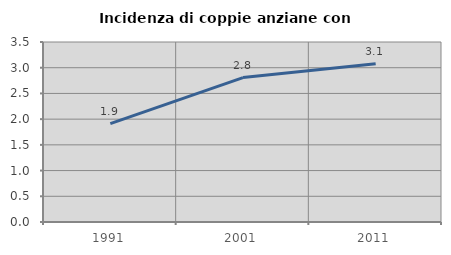
| Category | Incidenza di coppie anziane con figli |
|---|---|
| 1991.0 | 1.914 |
| 2001.0 | 2.808 |
| 2011.0 | 3.076 |